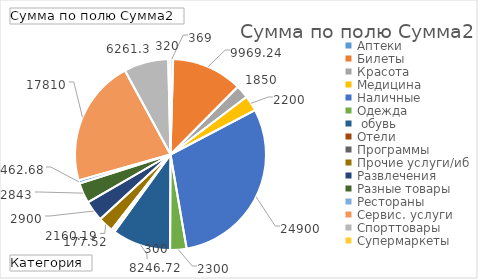
| Category | Итог |
|---|---|
| Аптеки | 369 |
| Билеты | 9969.24 |
| Красота | 1850 |
| Медицина | 2200 |
| Наличные | 24900 |
| Одежда, обувь | 2300 |
| Отели | 8246.72 |
| Программы | 300 |
| Прочие услуги/иб | 177.52 |
| Развлечения | 2160.19 |
| Разные товары | 2900 |
| Рестораны | 2843 |
| Сервис. услуги | 462.68 |
| Спорттовары | 17810 |
| Супермаркеты | 6261.3 |
| Транспорт | 320 |